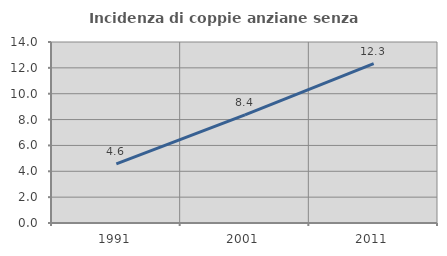
| Category | Incidenza di coppie anziane senza figli  |
|---|---|
| 1991.0 | 4.576 |
| 2001.0 | 8.36 |
| 2011.0 | 12.33 |